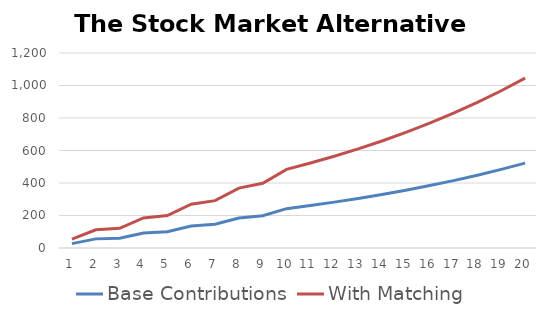
| Category | Base Contributions | With Matching |
|---|---|---|
| 0 | 27 | 54 |
| 1 | 56.16 | 112.32 |
| 2 | 60.653 | 121.306 |
| 3 | 92.505 | 185.01 |
| 4 | 99.905 | 199.811 |
| 5 | 134.898 | 269.796 |
| 6 | 145.69 | 291.379 |
| 7 | 184.345 | 368.69 |
| 8 | 199.092 | 398.185 |
| 9 | 242.02 | 484.04 |
| 10 | 261.381 | 522.763 |
| 11 | 282.292 | 564.584 |
| 12 | 304.875 | 609.751 |
| 13 | 329.265 | 658.531 |
| 14 | 355.607 | 711.213 |
| 15 | 384.055 | 768.11 |
| 16 | 414.779 | 829.559 |
| 17 | 447.962 | 895.924 |
| 18 | 483.799 | 967.598 |
| 19 | 522.503 | 1045.005 |